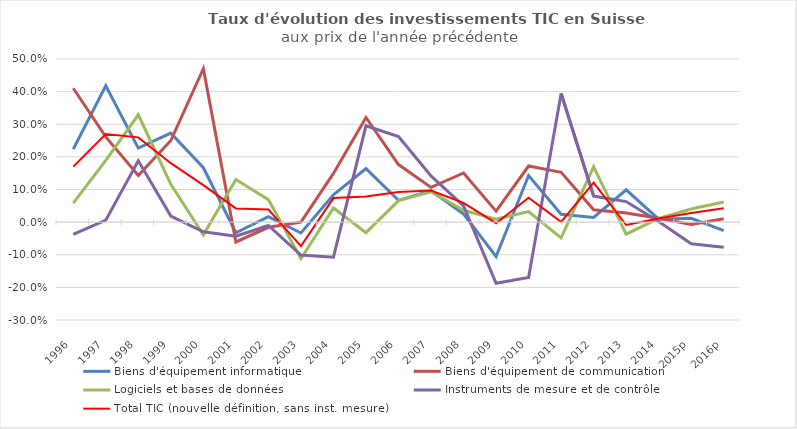
| Category | Biens d'équipement informatique | Biens d'équipement de communication | Logiciels et bases de données | Instruments de mesure et de contrôle | Total TIC (nouvelle définition, sans inst. mesure) |
|---|---|---|---|---|---|
| 1996 | 0.224 | 0.41 | 0.058 | -0.037 | 0.17 |
| 1997 | 0.418 | 0.261 | 0.189 | 0.006 | 0.27 |
| 1998 | 0.227 | 0.143 | 0.329 | 0.188 | 0.26 |
| 1999 | 0.273 | 0.25 | 0.116 | 0.019 | 0.181 |
| 2000 | 0.167 | 0.47 | -0.039 | -0.029 | 0.113 |
| 2001 | -0.033 | -0.061 | 0.131 | -0.043 | 0.042 |
| 2002 | 0.017 | -0.016 | 0.069 | -0.01 | 0.039 |
| 2003 | -0.033 | 0 | -0.112 | -0.101 | -0.074 |
| 2004 | 0.084 | 0.149 | 0.043 | -0.108 | 0.074 |
| 2005 | 0.164 | 0.321 | -0.032 | 0.295 | 0.079 |
| 2006 | 0.067 | 0.176 | 0.066 | 0.262 | 0.092 |
| 2007 | 0.096 | 0.106 | 0.093 | 0.142 | 0.097 |
| 2008 | 0.025 | 0.151 | 0.036 | 0.05 | 0.059 |
| 2009 | -0.105 | 0.034 | 0.009 | -0.188 | -0.003 |
| 2010 | 0.143 | 0.172 | 0.032 | -0.17 | 0.075 |
| 2011 | 0.024 | 0.153 | -0.049 | 0.394 | 0.001 |
| 2012 | 0.014 | 0.038 | 0.17 | 0.08 | 0.121 |
| 2013 | 0.099 | 0.028 | -0.037 | 0.063 | -0.009 |
| 2014 | 0.009 | 0.012 | 0.011 | 0.002 | 0.011 |
| 2015p | 0.012 | -0.007 | 0.04 | -0.066 | 0.028 |
| 2016p | -0.026 | 0.01 | 0.062 | -0.077 | 0.043 |